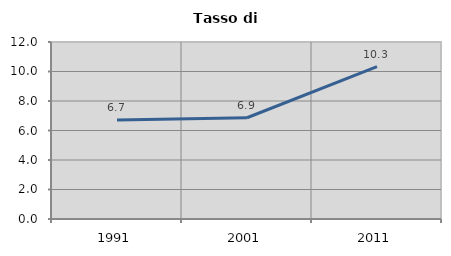
| Category | Tasso di disoccupazione   |
|---|---|
| 1991.0 | 6.706 |
| 2001.0 | 6.866 |
| 2011.0 | 10.335 |